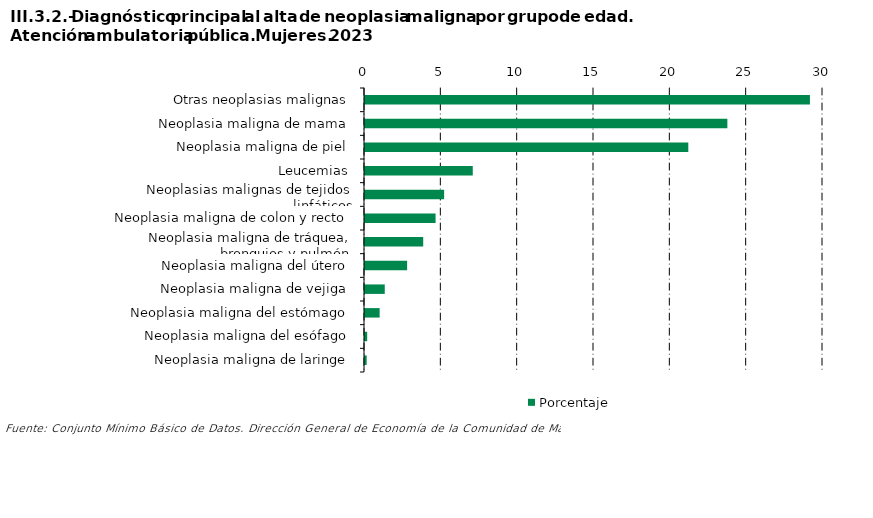
| Category | Porcentaje |
|---|---|
| Otras neoplasias malignas | 29.144 |
| Neoplasia maligna de mama | 23.735 |
| Neoplasia maligna de piel | 21.177 |
| Leucemias | 7.059 |
| Neoplasias malignas de tejidos linfáticos | 5.183 |
| Neoplasia maligna de colon y recto | 4.623 |
| Neoplasia maligna de tráquea, bronquios y pulmón | 3.813 |
| Neoplasia maligna del útero | 2.759 |
| Neoplasia maligna de vejiga | 1.294 |
| Neoplasia maligna del estómago | 0.959 |
| Neoplasia maligna del esófago | 0.143 |
| Neoplasia maligna de laringe | 0.11 |